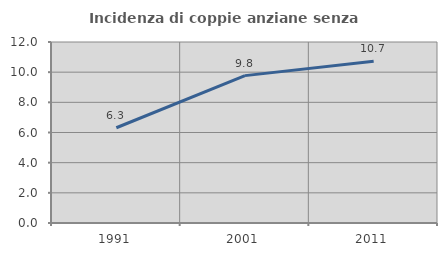
| Category | Incidenza di coppie anziane senza figli  |
|---|---|
| 1991.0 | 6.316 |
| 2001.0 | 9.77 |
| 2011.0 | 10.729 |